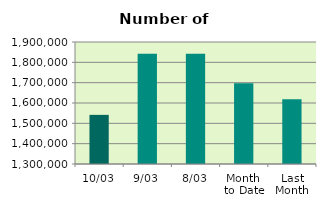
| Category | Series 0 |
|---|---|
| 10/03 | 1541684 |
| 9/03 | 1842330 |
| 8/03 | 1842114 |
| Month 
to Date | 1696542.5 |
| Last
Month | 1618522.4 |